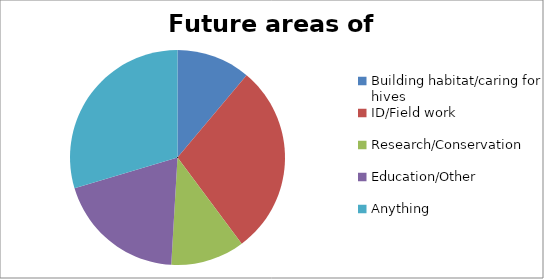
| Category | Series 0 |
|---|---|
| Building habitat/caring for hives | 12.245 |
| ID/Field work | 31.633 |
| Research/Conservation | 12.245 |
| Education/Other | 21.429 |
| Anything | 32.653 |